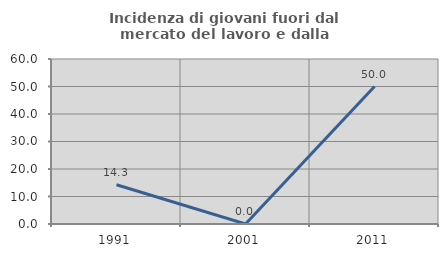
| Category | Incidenza di giovani fuori dal mercato del lavoro e dalla formazione  |
|---|---|
| 1991.0 | 14.286 |
| 2001.0 | 0 |
| 2011.0 | 50 |